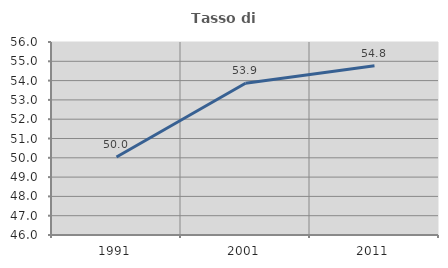
| Category | Tasso di occupazione   |
|---|---|
| 1991.0 | 50.038 |
| 2001.0 | 53.861 |
| 2011.0 | 54.769 |